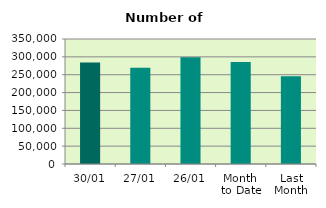
| Category | Series 0 |
|---|---|
| 30/01 | 284234 |
| 27/01 | 269842 |
| 26/01 | 298902 |
| Month 
to Date | 285815.143 |
| Last
Month | 245553.619 |